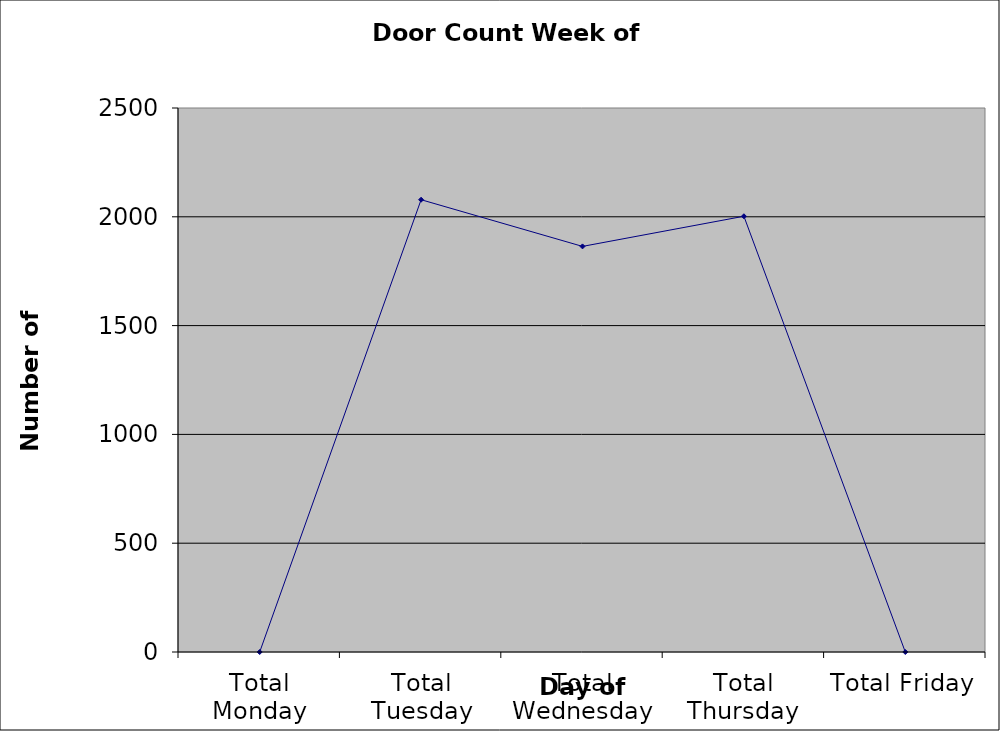
| Category | Series 0 |
|---|---|
| Total Monday | 0 |
| Total Tuesday | 2078.5 |
| Total Wednesday | 1864 |
| Total Thursday | 2002.5 |
| Total Friday | 0 |